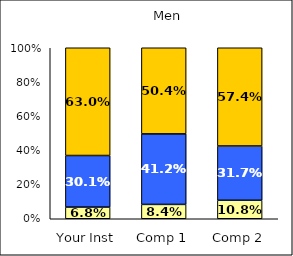
| Category | Low Scholarly Productivity | Average Scholarly Productivity | High Scholarly Productivity |
|---|---|---|---|
| Your Inst | 0.068 | 0.301 | 0.63 |
| Comp 1 | 0.084 | 0.412 | 0.504 |
| Comp 2 | 0.108 | 0.317 | 0.574 |